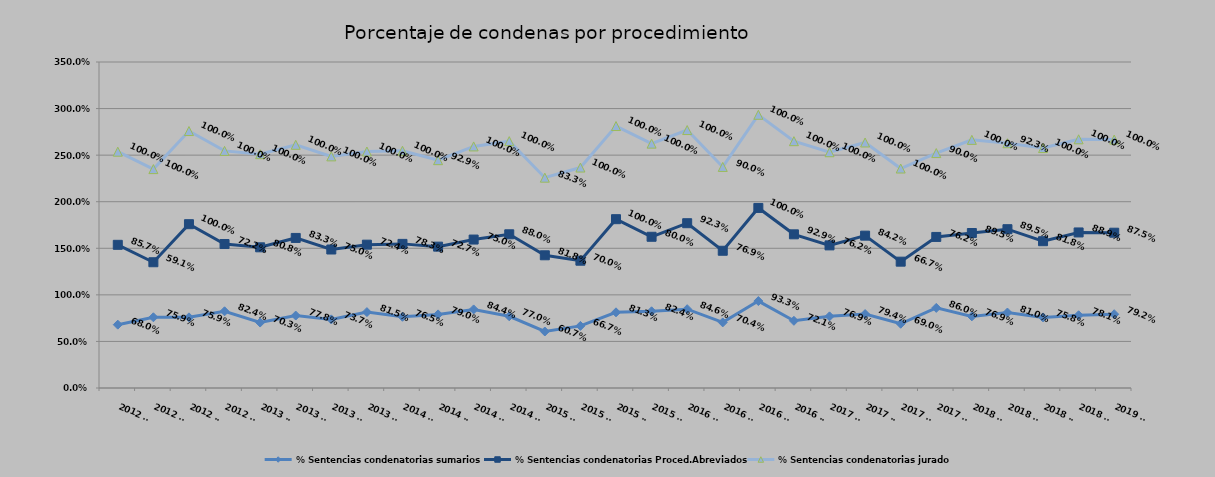
| Category | % Sentencias condenatorias sumarios | % Sentencias condenatorias Proced.Abreviados | % Sentencias condenatorias jurado |
|---|---|---|---|
| 2012 T1 | 0.68 | 0.857 | 1 |
| 2012 T2 | 0.759 | 0.591 | 1 |
| 2012 T3 | 0.759 | 1 | 1 |
| 2012 T4 | 0.824 | 0.722 | 1 |
| 2013 T1 | 0.703 | 0.808 | 1 |
| 2013 T2 | 0.778 | 0.833 | 1 |
| 2013 T3 | 0.737 | 0.75 | 1 |
| 2013 T4 | 0.815 | 0.724 | 1 |
| 2014 T1 | 0.765 | 0.783 | 1 |
| 2014 T2 | 0.79 | 0.727 | 0.929 |
| 2014 T3 | 0.844 | 0.75 | 1 |
| 2014 T4 | 0.77 | 0.88 | 1 |
| 2015 T1 | 0.607 | 0.818 | 0.833 |
| 2015 T2 | 0.667 | 0.7 | 1 |
| 2015 T3 | 0.812 | 1 | 1 |
| 2015 T4 | 0.824 | 0.8 | 1 |
| 2016 T1 | 0.846 | 0.923 | 1 |
| 2016 T2 | 0.704 | 0.769 | 0.9 |
| 2016 T3 | 0.933 | 1 | 1 |
| 2016 T4 | 0.721 | 0.929 | 1 |
| 2017 T1 | 0.769 | 0.762 | 1 |
| 2017 T2 | 0.794 | 0.842 | 1 |
| 2017 T3 | 0.69 | 0.667 | 1 |
| 2017 T4 | 0.86 | 0.762 | 0.9 |
| 2018 T1 | 0.769 | 0.895 | 1 |
| 2018 T2 | 0.81 | 0.895 | 0.923 |
| 2018 T3 | 0.758 | 0.818 | 1 |
| 2018 T4 | 0.781 | 0.889 | 1 |
| 2019 T1 | 0.792 | 0.875 | 1 |